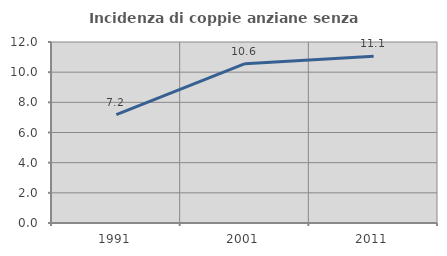
| Category | Incidenza di coppie anziane senza figli  |
|---|---|
| 1991.0 | 7.182 |
| 2001.0 | 10.56 |
| 2011.0 | 11.06 |